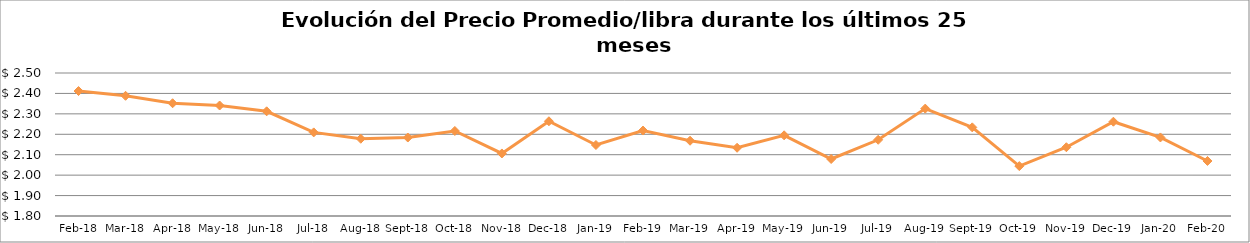
| Category | Series 0 |
|---|---|
| 2018-02-01 | 2.412 |
| 2018-03-01 | 2.388 |
| 2018-04-01 | 2.352 |
| 2018-05-01 | 2.341 |
| 2018-06-01 | 2.312 |
| 2018-07-01 | 2.209 |
| 2018-08-01 | 2.178 |
| 2018-09-01 | 2.184 |
| 2018-10-01 | 2.216 |
| 2018-11-01 | 2.106 |
| 2018-12-01 | 2.264 |
| 2019-01-01 | 2.147 |
| 2019-02-01 | 2.218 |
| 2019-03-01 | 2.169 |
| 2019-04-01 | 2.134 |
| 2019-05-01 | 2.195 |
| 2019-06-01 | 2.079 |
| 2019-07-01 | 2.173 |
| 2019-08-01 | 2.326 |
| 2019-09-01 | 2.234 |
| 2019-10-01 | 2.044 |
| 2019-11-01 | 2.137 |
| 2019-12-01 | 2.262 |
| 2020-01-01 | 2.185 |
| 2020-02-01 | 2.069 |